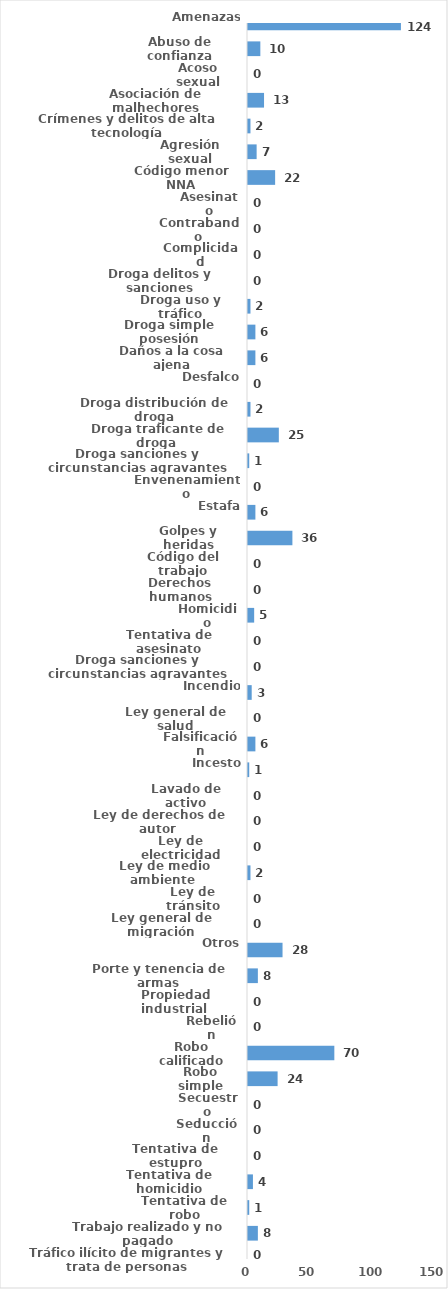
| Category | Series 0 |
|---|---|
| Amenazas | 124 |
| Abuso de confianza | 10 |
| Acoso sexual | 0 |
| Asociación de malhechores | 13 |
| Crímenes y delitos de alta tecnología | 2 |
| Agresión sexual | 7 |
| Código menor NNA | 22 |
| Asesinato | 0 |
| Contrabando | 0 |
| Complicidad | 0 |
| Droga delitos y sanciones | 0 |
| Droga uso y tráfico | 2 |
| Droga simple posesión | 6 |
| Daños a la cosa ajena | 6 |
| Desfalco | 0 |
| Droga distribución de droga | 2 |
| Droga traficante de droga  | 25 |
| Droga sanciones y circunstancias agravantes | 1 |
| Envenenamiento | 0 |
| Estafa | 6 |
| Golpes y heridas | 36 |
| Código del trabajo | 0 |
| Derechos humanos | 0 |
| Homicidio | 5 |
| Tentativa de asesinato | 0 |
| Droga sanciones y circunstancias agravantes | 0 |
| Incendio | 3 |
| Ley general de salud | 0 |
| Falsificación | 6 |
| Incesto | 1 |
| Lavado de activo | 0 |
| Ley de derechos de autor  | 0 |
| Ley de electricidad | 0 |
| Ley de medio ambiente  | 2 |
| Ley de tránsito | 0 |
| Ley general de migración | 0 |
| Otros | 28 |
| Porte y tenencia de armas | 8 |
| Propiedad industrial  | 0 |
| Rebelión | 0 |
| Robo calificado | 70 |
| Robo simple | 24 |
| Secuestro | 0 |
| Seducción | 0 |
| Tentativa de estupro | 0 |
| Tentativa de homicidio | 4 |
| Tentativa de robo | 1 |
| Trabajo realizado y no pagado | 8 |
| Tráfico ilícito de migrantes y trata de personas | 0 |